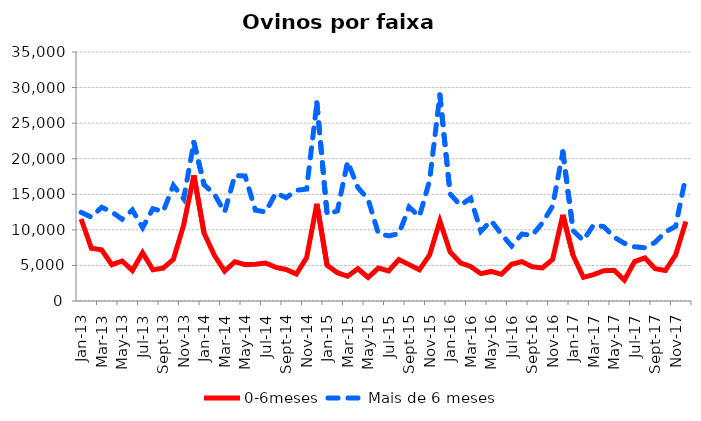
| Category | 0-6meses | Mais de 6 meses |
|---|---|---|
| 2013-01-01 | 11530 | 12463 |
| 2013-02-01 | 7414 | 11796 |
| 2013-03-01 | 7187 | 13178 |
| 2013-04-01 | 5101 | 12519 |
| 2013-05-01 | 5621 | 11492 |
| 2013-06-01 | 4294 | 12798 |
| 2013-07-01 | 6780 | 10308 |
| 2013-08-01 | 4403 | 12975 |
| 2013-09-01 | 4617 | 12554 |
| 2013-10-01 | 5856 | 16249 |
| 2013-11-01 | 10669 | 14361 |
| 2013-12-01 | 17662 | 22293 |
| 2014-01-01 | 9530 | 16343 |
| 2014-02-01 | 6416 | 15027 |
| 2014-03-01 | 4210 | 12495 |
| 2014-04-01 | 5526 | 17659 |
| 2014-05-01 | 5114 | 17564 |
| 2014-06-01 | 5154 | 12769 |
| 2014-07-01 | 5341 | 12515 |
| 2014-08-01 | 4722 | 15190 |
| 2014-09-01 | 4425 | 14519 |
| 2014-10-01 | 3796 | 15562 |
| 2014-11-01 | 6092 | 15732 |
| 2014-12-01 | 13659 | 27848 |
| 2015-01-01 | 5005 | 12160 |
| 2015-02-01 | 3981 | 12674 |
| 2015-03-01 | 3471 | 19598 |
| 2015-04-01 | 4536 | 15953 |
| 2015-05-01 | 3304 | 14302 |
| 2015-06-01 | 4629 | 9462 |
| 2015-07-01 | 4232 | 9160 |
| 2015-08-01 | 5834 | 9455 |
| 2015-09-01 | 5114 | 13210 |
| 2015-10-01 | 4381 | 11872 |
| 2015-11-01 | 6471 | 16936 |
| 2015-12-01 | 11254 | 28973 |
| 2016-01-01 | 6897 | 15037 |
| 2016-02-01 | 5368 | 13456 |
| 2016-03-01 | 4864 | 14442 |
| 2016-04-01 | 3842 | 9795 |
| 2016-05-01 | 4155 | 11288 |
| 2016-06-01 | 3753 | 9405 |
| 2016-07-01 | 5168 | 7726 |
| 2016-08-01 | 5545 | 9412 |
| 2016-09-01 | 4801 | 9215 |
| 2016-10-01 | 4657 | 10970 |
| 2016-11-01 | 5854 | 13349 |
| 2016-12-01 | 12120 | 20961 |
| 2017-01-01 | 6396 | 9871 |
| 2017-02-01 | 3331 | 8517 |
| 2017-03-01 | 3706 | 10714 |
| 2017-04-01 | 4256 | 10447 |
| 2017-05-01 | 4319 | 8979 |
| 2017-06-01 | 2930 | 8108 |
| 2017-07-01 | 5539 | 7625 |
| 2017-08-01 | 6063 | 7482 |
| 2017-09-01 | 4550 | 8248 |
| 2017-10-01 | 4280 | 9697 |
| 2017-11-01 | 6477 | 10497 |
| 2017-12-01 | 11177 | 17581 |